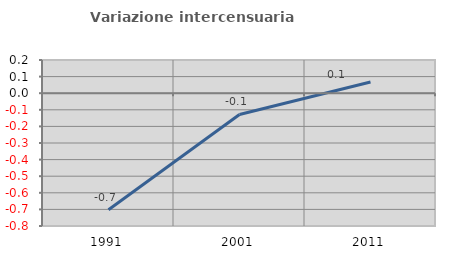
| Category | Variazione intercensuaria annua |
|---|---|
| 1991.0 | -0.702 |
| 2001.0 | -0.128 |
| 2011.0 | 0.068 |